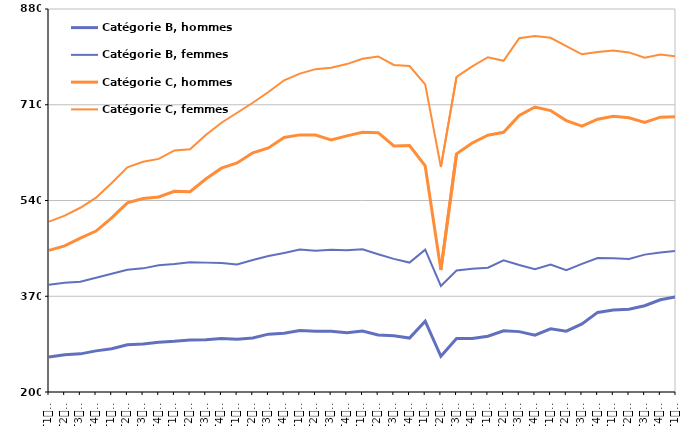
| Category | Catégorie B, hommes | Catégorie B, femmes | Catégorie C, hommes | Catégorie C, femmes |
|---|---|---|---|---|
| T1
2014 | 262 | 390.4 | 451.5 | 502.6 |
| T2
2014 | 266 | 394.1 | 459.4 | 513 |
| T3
2014 | 267.7 | 395.6 | 473.2 | 527.1 |
| T4
2014 | 273 | 402.7 | 485.7 | 545 |
| T1
2015 | 276.9 | 410 | 509.1 | 571 |
| T2
2015 | 284 | 417 | 535.7 | 598.8 |
| T3
2015 | 285.1 | 419.5 | 543.4 | 608.8 |
| T4
2015 | 288.5 | 425 | 546.3 | 613.9 |
| T1
2016 | 289.9 | 427.1 | 556.4 | 628.8 |
| T2
2016 | 292.3 | 430.5 | 555.5 | 631.1 |
| T3
2016 | 292.9 | 429.7 | 578.1 | 656.2 |
| T4
2016 | 295 | 429.2 | 597.4 | 678.1 |
| T1
2017 | 293.7 | 426.6 | 606.6 | 695.8 |
| T2
2017 | 295.8 | 434.3 | 624.7 | 713.5 |
| T3
2017 | 302.7 | 441.5 | 633.4 | 732.6 |
| T4
2017 | 304.4 | 446.9 | 651.8 | 753.4 |
| T1
2018 | 309.3 | 452.8 | 656.5 | 765.2 |
| T2
2018 | 307.8 | 450.9 | 656.3 | 773.2 |
| T3
2018 | 307.9 | 452.6 | 647.6 | 775.8 |
| T4
2018 | 305.4 | 451.5 | 654.8 | 782.2 |
| T1
2019 | 308.1 | 453.3 | 661.2 | 791.5 |
| T2
2019 | 301.4 | 444.6 | 660.5 | 795.8 |
| T3
2019 | 299.8 | 436.4 | 636.8 | 780.7 |
| T4
2019 | 295.8 | 429.8 | 637.6 | 778.7 |
| T1
2020 | 325.8 | 452.8 | 601.4 | 746.1 |
| T2
2020 | 263.3 | 388.2 | 416.7 | 599.5 |
| T3
2020 | 295.1 | 415.8 | 623 | 759.6 |
| T4
2020 | 295 | 419 | 642.2 | 778 |
| T1
2021 | 299.1 | 420.6 | 655.9 | 794.4 |
| T2
2021 | 308.7 | 433.9 | 661 | 788 |
| T3
2021 | 307.2 | 425.4 | 691.1 | 828.2 |
| T4
2021 | 301 | 418 | 706 | 832.2 |
| T1
2022 | 312.2 | 426.4 | 699.7 | 828.9 |
| T2
2022 | 308 | 416.1 | 681.9 | 814.2 |
| T3
2022 | 320.9 | 427.4 | 671.9 | 799.6 |
| T4
2022 | 341.3 | 438 | 684.4 | 803.8 |
| T1
2023 | 345.6 | 437.5 | 689.7 | 806.4 |
| T2
2023 | 347 | 436 | 686.9 | 802.9 |
| T3
2023 | 353.1 | 443.9 | 678.5 | 793.6 |
| T4
2023 | 363.8 | 447.6 | 688 | 799.2 |
| T1
2024 | 369 | 450.6 | 688.8 | 796 |